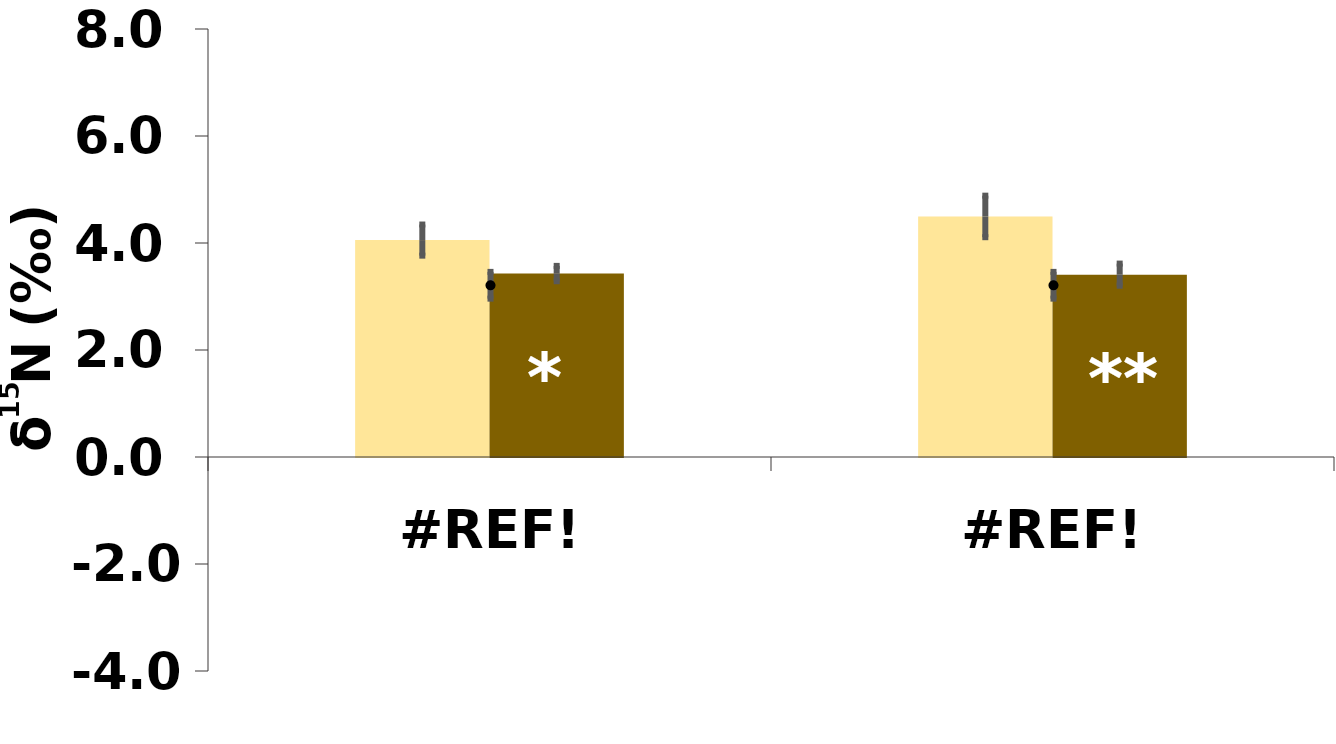
| Category | Root | Shoot |
|---|---|---|
| 0.0 | 4.054 | 3.429 |
| 0.0 | 4.497 | 3.408 |